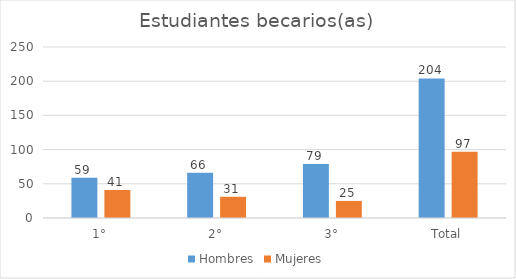
| Category | Hombres | Mujeres |
|---|---|---|
| 1° | 59 | 41 |
| 2° | 66 | 31 |
| 3° | 79 | 25 |
| Total | 204 | 97 |